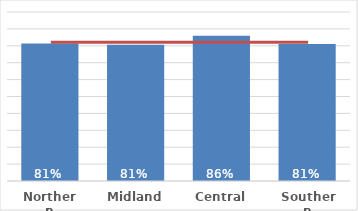
| Category | Total |
|---|---|
| Northern | 0.814 |
| Midland | 0.806 |
| Central | 0.86 |
| Southern | 0.811 |